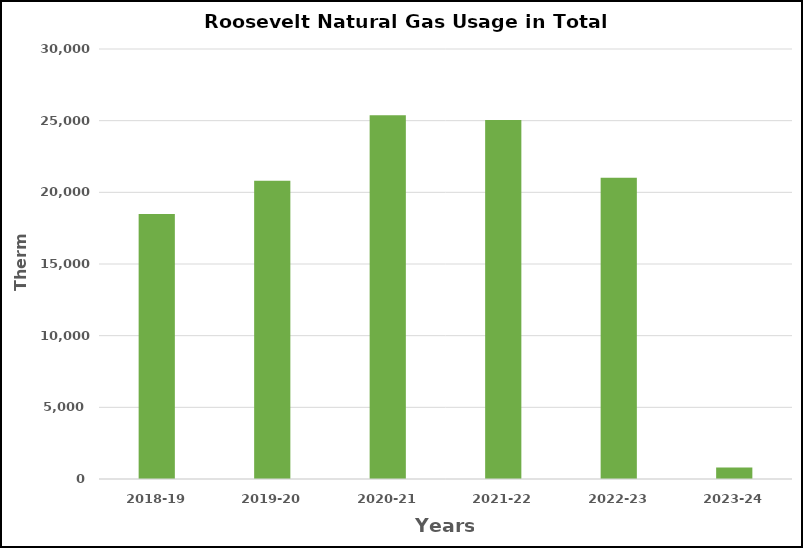
| Category | Series 0 |
|---|---|
| 2018-19 | 18497 |
| 2019-20 | 20801 |
| 2020-21 | 25374 |
| 2021-22 | 25043 |
| 2022-23 | 21012 |
| 2023-24 | 806 |